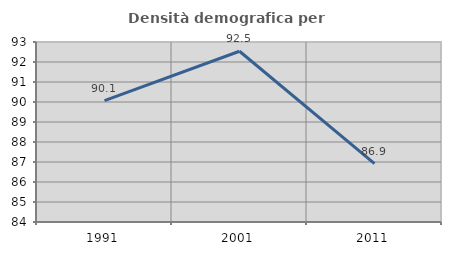
| Category | Densità demografica |
|---|---|
| 1991.0 | 90.069 |
| 2001.0 | 92.537 |
| 2011.0 | 86.916 |